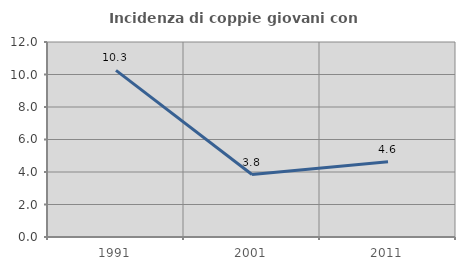
| Category | Incidenza di coppie giovani con figli |
|---|---|
| 1991.0 | 10.256 |
| 2001.0 | 3.846 |
| 2011.0 | 4.636 |